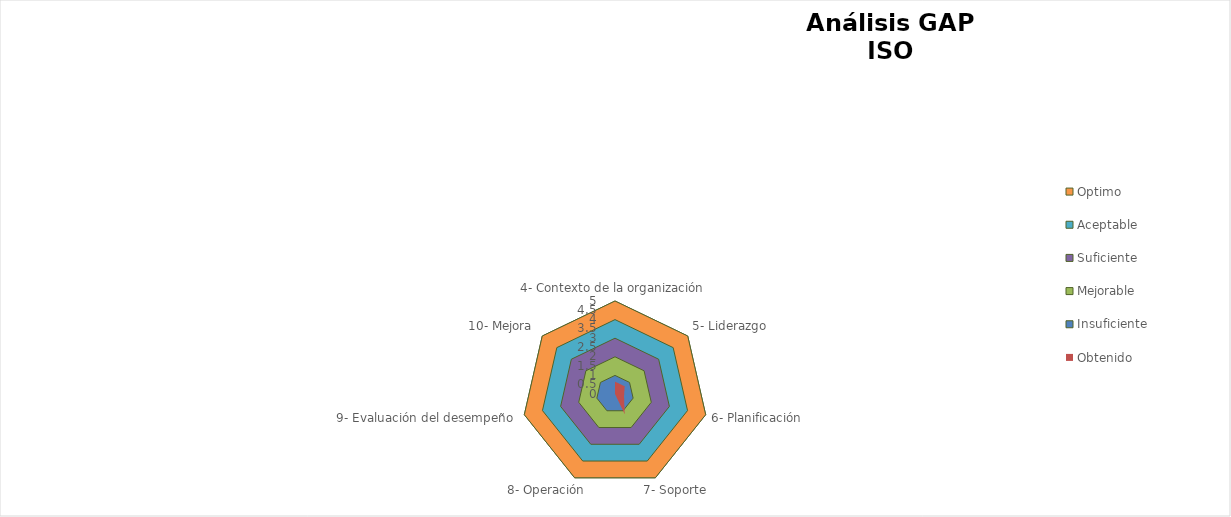
| Category | Optimo | Aceptable | Suficiente | Mejorable | Insuficiente | Obtenido |
|---|---|---|---|---|---|---|
| 4- Contexto de la organización | 5 | 4 | 3 | 2 | 1 | 0.667 |
| 5- Liderazgo | 5 | 4 | 3 | 2 | 1 | 0.667 |
| 6- Planificación | 5 | 4 | 3 | 2 | 1 | 0.5 |
| 7- Soporte | 5 | 4 | 3 | 2 | 1 | 1.2 |
| 8- Operación | 5 | 4 | 3 | 2 | 1 | 0 |
| 9- Evaluación del desempeño | 5 | 4 | 3 | 2 | 1 | 0 |
| 10- Mejora | 5 | 4 | 3 | 2 | 1 | 0 |